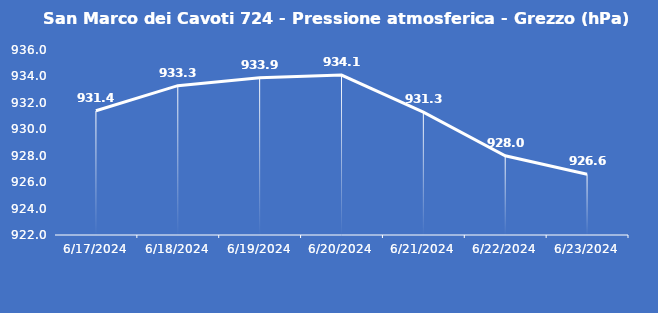
| Category | San Marco dei Cavoti 724 - Pressione atmosferica - Grezzo (hPa) |
|---|---|
| 6/17/24 | 931.4 |
| 6/18/24 | 933.3 |
| 6/19/24 | 933.9 |
| 6/20/24 | 934.1 |
| 6/21/24 | 931.3 |
| 6/22/24 | 928 |
| 6/23/24 | 926.6 |